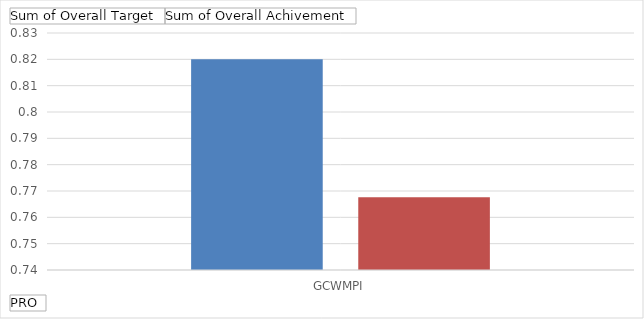
| Category | Sum of Overall Target | Sum of Overall Achivement |
|---|---|---|
| GCWMPI | 0.82 | 0.768 |